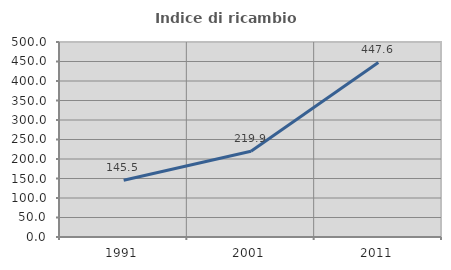
| Category | Indice di ricambio occupazionale  |
|---|---|
| 1991.0 | 145.49 |
| 2001.0 | 219.88 |
| 2011.0 | 447.581 |